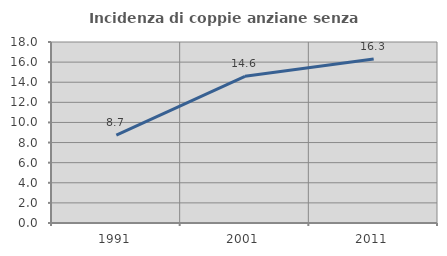
| Category | Incidenza di coppie anziane senza figli  |
|---|---|
| 1991.0 | 8.735 |
| 2001.0 | 14.589 |
| 2011.0 | 16.304 |